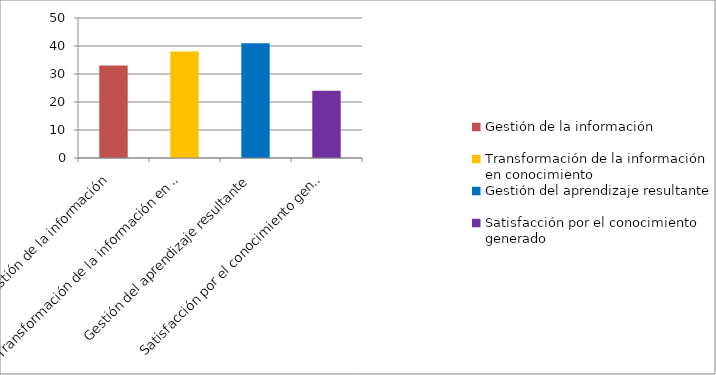
| Category | Series 0 |
|---|---|
| Gestión de la información | 33 |
| Transformación de la información en conocimiento | 38 |
| Gestión del aprendizaje resultante | 41 |
| Satisfacción por el conocimiento generado | 24 |